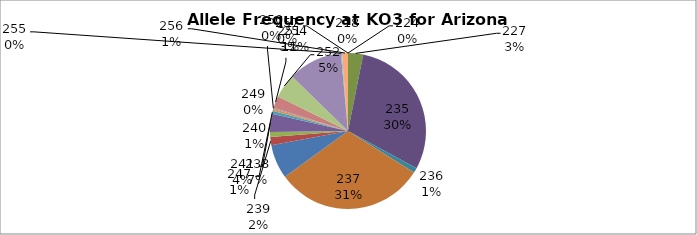
| Category | Series 0 |
|---|---|
| 218.0 | 0 |
| 224.0 | 0 |
| 227.0 | 0.031 |
| 235.0 | 0.298 |
| 236.0 | 0.01 |
| 237.0 | 0.31 |
| 238.0 | 0.071 |
| 239.0 | 0.017 |
| 240.0 | 0.01 |
| 241.0 | 0.038 |
| 247.0 | 0.006 |
| 249.0 | 0.004 |
| 250.0 | 0.002 |
| 251.0 | 0.025 |
| 252.0 | 0.05 |
| 254.0 | 0.112 |
| 255.0 | 0.002 |
| 256.0 | 0.012 |
| 257.0 | 0 |